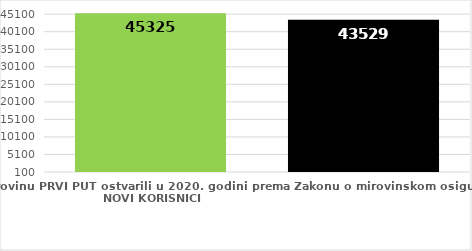
| Category | broj korisnika |
|---|---|
| Korisnici koji su pravo na mirovinu PRVI PUT ostvarili u 2020. godini prema Zakonu o mirovinskom osiguranju - NOVI KORISNICI | 45325 |
| Korisnici mirovina kojima je u 2020. godini PRESTALO PRAVO NA MIROVINU - uzrok smrt 
koji su pravo na mirovinu ostvarili prema Zakonu o mirovinskom osiguranju | 43529 |